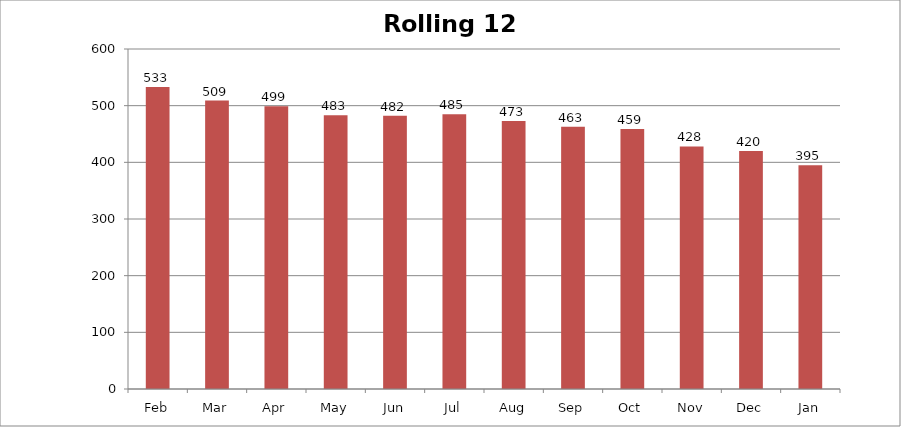
| Category | Rolling 12 Month |
|---|---|
| Feb | 533 |
| Mar | 509 |
| Apr | 499 |
| May | 483 |
| Jun | 482 |
| Jul | 485 |
| Aug | 473 |
| Sep | 463 |
| Oct | 459 |
| Nov | 428 |
| Dec | 420 |
| Jan | 395 |